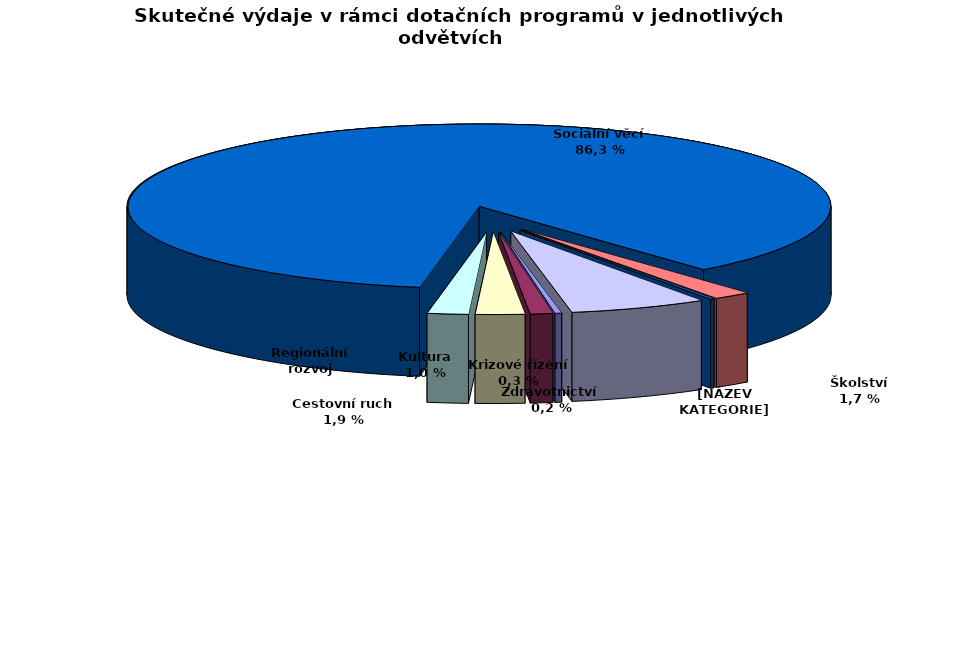
| Category | Series 0 |
|---|---|
| Krizové řízení | 8572.636 |
| Kultura | 28523.458 |
| Regionální rozvoj | 62639.859 |
| Cestovní ruch | 52218.601 |
| Sociální věcí | 2392594.421 |
| Školství | 48089.712 |
| Zdravotnictví | 4934.3 |
| Životní prostředí  | 175317.674 |